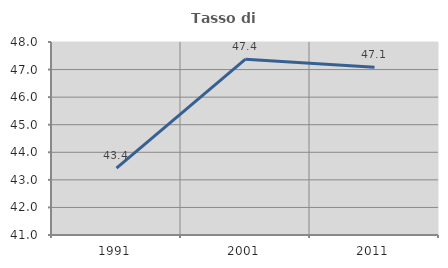
| Category | Tasso di occupazione   |
|---|---|
| 1991.0 | 43.426 |
| 2001.0 | 47.378 |
| 2011.0 | 47.084 |